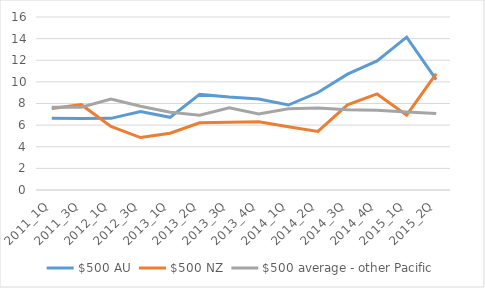
| Category | $500 AU | $500 NZ | $500 average - other Pacific |
|---|---|---|---|
| 2011_1Q | 6.625 | 7.527 | 7.658 |
| 2011_3Q | 6.621 | 7.892 | 7.648 |
| 2012_1Q | 6.626 | 5.883 | 8.417 |
| 2012_3Q | 7.253 | 4.849 | 7.742 |
| 2013_1Q | 6.72 | 5.248 | 7.186 |
| 2013_2Q | 8.842 | 6.223 | 6.906 |
| 2013_3Q | 8.598 | 6.275 | 7.609 |
| 2013_4Q | 8.421 | 6.315 | 7.031 |
| 2014_1Q | 7.858 | 5.847 | 7.509 |
| 2014_2Q | 9.017 | 5.421 | 7.585 |
| 2014_3Q | 10.713 | 7.875 | 7.415 |
| 2014_4Q | 11.945 | 8.884 | 7.377 |
| 2015_1Q | 14.142 | 6.919 | 7.213 |
| 2015_2Q | 10.216 | 10.754 | 7.08 |